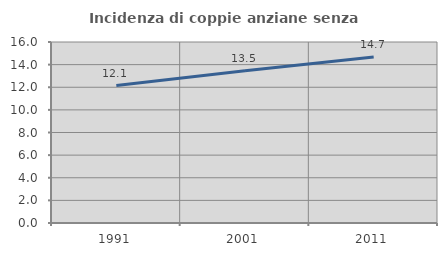
| Category | Incidenza di coppie anziane senza figli  |
|---|---|
| 1991.0 | 12.145 |
| 2001.0 | 13.458 |
| 2011.0 | 14.677 |